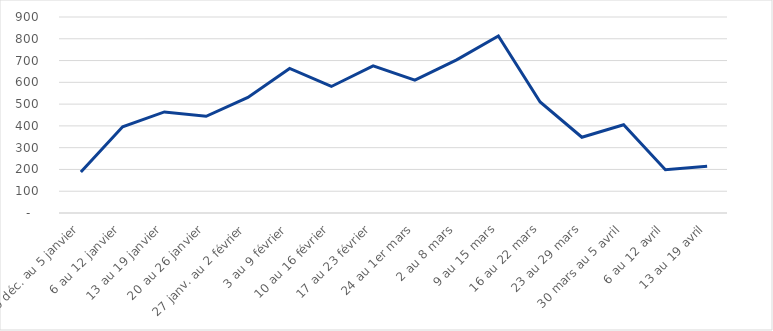
| Category | Series 0 |
|---|---|
| 30 déc. au 5 janvier | 188 |
| 6 au 12 janvier | 396 |
| 13 au 19 janvier | 464 |
| 20 au 26 janvier | 444 |
| 27 janv. au 2 février | 531 |
| 3 au 9 février | 664 |
| 10 au 16 février | 581 |
| 17 au 23 février | 676 |
| 24 au 1er mars | 610 |
| 2 au 8 mars | 703 |
| 9 au 15 mars | 813 |
| 16 au 22 mars | 510 |
| 23 au 29 mars | 348 |
| 30 mars au 5 avril | 405 |
| 6 au 12 avril | 199 |
| 13 au 19 avril | 215 |